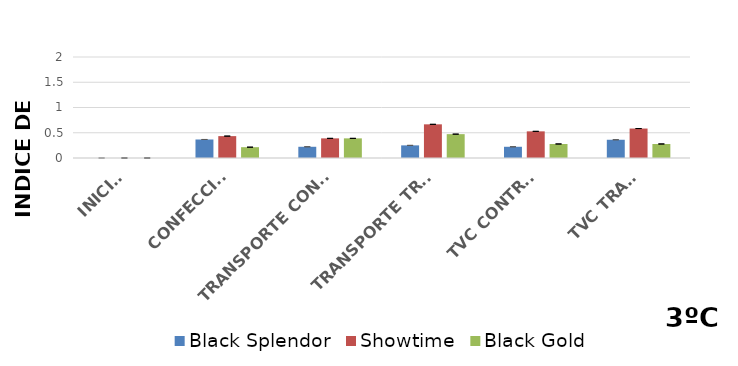
| Category | Black Splendor | Showtime | Black Gold |
|---|---|---|---|
| INICIAL | 0 | 0 | 0 |
| CONFECCIÓN | 0.367 | 0.433 | 0.214 |
|  TRANSPORTE CONTROL | 0.222 | 0.389 | 0.389 |
| TRANSPORTE TRAT. | 0.25 | 0.667 | 0.472 |
| TVC CONTROL | 0.222 | 0.528 | 0.278 |
| TVC TRAT. | 0.361 | 0.583 | 0.278 |